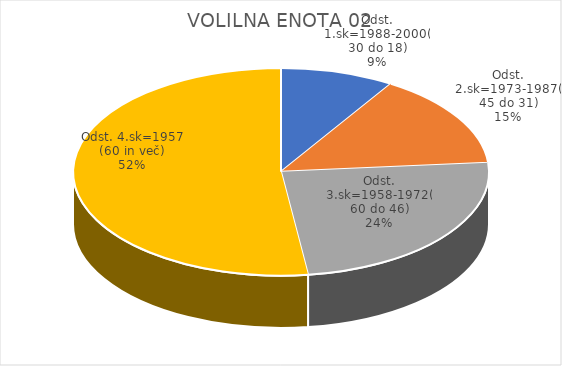
| Category | VOLILNA ENOTA 02 |
|---|---|
| Odst. 1.sk=1988-2000(30 do 18) | 2.52 |
| Odst. 2.sk=1973-1987(45 do 31) | 4.19 |
| Odst. 3.sk=1958-1972(60 do 46) | 6.92 |
| Odst. 4.sk=1957 (60 in več) | 14.81 |